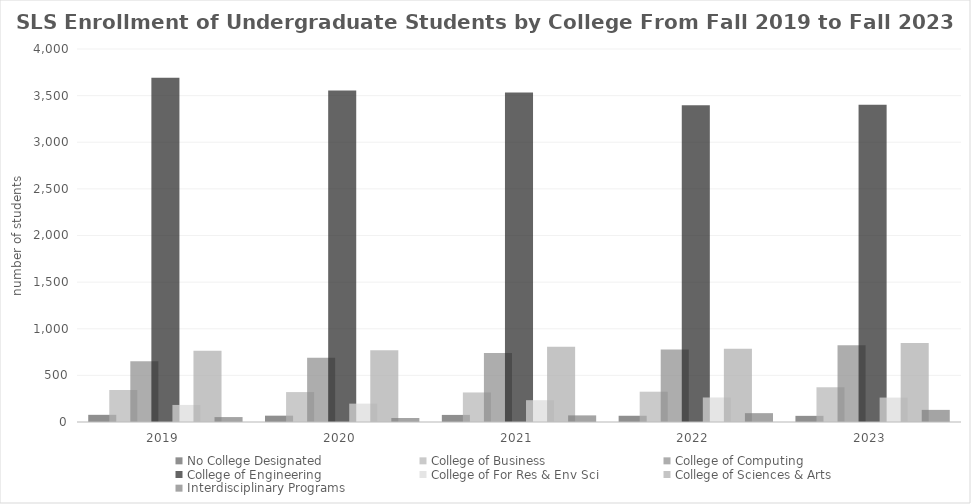
| Category | No College Designated | College of Business | College of Computing | College of Engineering | College of For Res & Env Sci | College of Sciences & Arts | Interdisciplinary Programs |
|---|---|---|---|---|---|---|---|
| 2019  | 77 | 344 | 651 | 3692 | 183 | 764 | 53 |
| 2020  | 68 | 321 | 689 | 3555 | 197 | 769 | 43 |
| 2021  | 76 | 317 | 741 | 3533 | 234 | 806 | 71 |
| 2022  | 67 | 325 | 777 | 3398 | 263 | 785 | 95 |
| 2023  | 66 | 373 | 824 | 3401 | 262 | 847 | 130 |